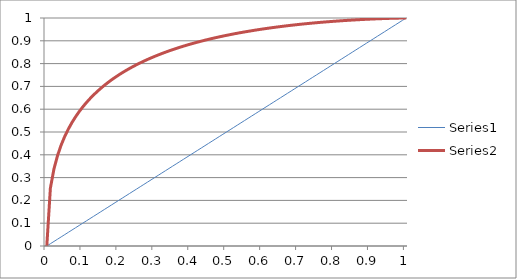
| Category | Series 0 | Series 1 |
|---|---|---|
| 0.0 | 0 | 0 |
| 0.01 | 0.01 | 0.254 |
| 0.02 | 0.02 | 0.339 |
| 0.03 | 0.03 | 0.397 |
| 0.04 | 0.04 | 0.443 |
| 0.05 | 0.05 | 0.481 |
| 0.060000000000000005 | 0.06 | 0.513 |
| 0.07 | 0.07 | 0.541 |
| 0.08 | 0.08 | 0.567 |
| 0.09 | 0.09 | 0.589 |
| 0.09999999999999999 | 0.1 | 0.61 |
| 0.10999999999999999 | 0.11 | 0.629 |
| 0.11999999999999998 | 0.12 | 0.646 |
| 0.12999999999999998 | 0.13 | 0.662 |
| 0.13999999999999999 | 0.14 | 0.677 |
| 0.15 | 0.15 | 0.691 |
| 0.16 | 0.16 | 0.704 |
| 0.17 | 0.17 | 0.717 |
| 0.18000000000000002 | 0.18 | 0.728 |
| 0.19000000000000003 | 0.19 | 0.74 |
| 0.20000000000000004 | 0.2 | 0.75 |
| 0.21000000000000005 | 0.21 | 0.76 |
| 0.22000000000000006 | 0.22 | 0.769 |
| 0.23000000000000007 | 0.23 | 0.779 |
| 0.24000000000000007 | 0.24 | 0.787 |
| 0.25000000000000006 | 0.25 | 0.795 |
| 0.26000000000000006 | 0.26 | 0.803 |
| 0.2700000000000001 | 0.27 | 0.811 |
| 0.2800000000000001 | 0.28 | 0.818 |
| 0.2900000000000001 | 0.29 | 0.825 |
| 0.3000000000000001 | 0.3 | 0.832 |
| 0.3100000000000001 | 0.31 | 0.838 |
| 0.3200000000000001 | 0.32 | 0.844 |
| 0.3300000000000001 | 0.33 | 0.85 |
| 0.34000000000000014 | 0.34 | 0.856 |
| 0.35000000000000014 | 0.35 | 0.861 |
| 0.36000000000000015 | 0.36 | 0.866 |
| 0.37000000000000016 | 0.37 | 0.871 |
| 0.38000000000000017 | 0.38 | 0.876 |
| 0.3900000000000002 | 0.39 | 0.881 |
| 0.4000000000000002 | 0.4 | 0.886 |
| 0.4100000000000002 | 0.41 | 0.89 |
| 0.4200000000000002 | 0.42 | 0.894 |
| 0.4300000000000002 | 0.43 | 0.899 |
| 0.4400000000000002 | 0.44 | 0.903 |
| 0.45000000000000023 | 0.45 | 0.906 |
| 0.46000000000000024 | 0.46 | 0.91 |
| 0.47000000000000025 | 0.47 | 0.914 |
| 0.48000000000000026 | 0.48 | 0.917 |
| 0.49000000000000027 | 0.49 | 0.921 |
| 0.5000000000000002 | 0.5 | 0.924 |
| 0.5100000000000002 | 0.51 | 0.927 |
| 0.5200000000000002 | 0.52 | 0.93 |
| 0.5300000000000002 | 0.53 | 0.933 |
| 0.5400000000000003 | 0.54 | 0.936 |
| 0.5500000000000003 | 0.55 | 0.939 |
| 0.5600000000000003 | 0.56 | 0.942 |
| 0.5700000000000003 | 0.57 | 0.944 |
| 0.5800000000000003 | 0.58 | 0.947 |
| 0.5900000000000003 | 0.59 | 0.949 |
| 0.6000000000000003 | 0.6 | 0.952 |
| 0.6100000000000003 | 0.61 | 0.954 |
| 0.6200000000000003 | 0.62 | 0.956 |
| 0.6300000000000003 | 0.63 | 0.958 |
| 0.6400000000000003 | 0.64 | 0.96 |
| 0.6500000000000004 | 0.65 | 0.962 |
| 0.6600000000000004 | 0.66 | 0.964 |
| 0.6700000000000004 | 0.67 | 0.966 |
| 0.6800000000000004 | 0.68 | 0.968 |
| 0.6900000000000004 | 0.69 | 0.97 |
| 0.7000000000000004 | 0.7 | 0.972 |
| 0.7100000000000004 | 0.71 | 0.973 |
| 0.7200000000000004 | 0.72 | 0.975 |
| 0.7300000000000004 | 0.73 | 0.976 |
| 0.7400000000000004 | 0.74 | 0.978 |
| 0.7500000000000004 | 0.75 | 0.979 |
| 0.7600000000000005 | 0.76 | 0.981 |
| 0.7700000000000005 | 0.77 | 0.982 |
| 0.7800000000000005 | 0.78 | 0.983 |
| 0.7900000000000005 | 0.79 | 0.985 |
| 0.8000000000000005 | 0.8 | 0.986 |
| 0.8100000000000005 | 0.81 | 0.987 |
| 0.8200000000000005 | 0.82 | 0.988 |
| 0.8300000000000005 | 0.83 | 0.989 |
| 0.8400000000000005 | 0.84 | 0.99 |
| 0.8500000000000005 | 0.85 | 0.991 |
| 0.8600000000000005 | 0.86 | 0.992 |
| 0.8700000000000006 | 0.87 | 0.993 |
| 0.8800000000000006 | 0.88 | 0.994 |
| 0.8900000000000006 | 0.89 | 0.994 |
| 0.9000000000000006 | 0.9 | 0.995 |
| 0.9100000000000006 | 0.91 | 0.996 |
| 0.9200000000000006 | 0.92 | 0.996 |
| 0.9300000000000006 | 0.93 | 0.997 |
| 0.9400000000000006 | 0.94 | 0.998 |
| 0.9500000000000006 | 0.95 | 0.998 |
| 0.9600000000000006 | 0.96 | 0.999 |
| 0.9700000000000006 | 0.97 | 0.999 |
| 0.9800000000000006 | 0.98 | 0.999 |
| 0.9900000000000007 | 0.99 | 1 |
| 1.0000000000000007 | 1 | 1 |